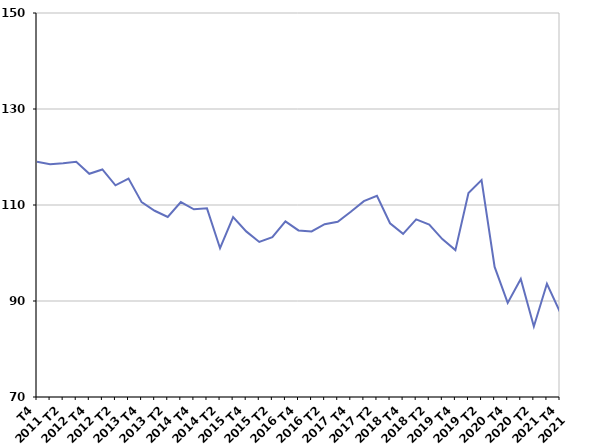
| Category | Fin de contrat |
|---|---|
| T4
2011 | 119 |
| T1
2012 | 118.5 |
| T2
2012 | 118.7 |
| T3
2012 | 119 |
| T4
2012 | 116.5 |
| T1
2013 | 117.4 |
| T2
2013 | 114.1 |
| T3
2013 | 115.5 |
| T4
2013 | 110.6 |
| T1
2014 | 108.8 |
| T2
2014 | 107.5 |
| T3
2014 | 110.6 |
| T4
2014 | 109.1 |
| T1
2015 | 109.3 |
| T2
2015 | 101 |
| T3
2015 | 107.5 |
| T4
2015 | 104.5 |
| T1
2016 | 102.3 |
| T2
2016 | 103.3 |
| T3
2016 | 106.6 |
| T4
2016 | 104.7 |
| T1
2017 | 104.5 |
| T2
2017 | 106 |
| T3
2017 | 106.5 |
| T4
2017 | 108.6 |
| T1
2018 | 110.8 |
| T2
2018 | 111.9 |
| T3
2018 | 106.2 |
| T4
2018 | 104 |
| T1
2019 | 107 |
| T2
2019 | 105.9 |
| T3
2019 | 102.9 |
| T4
2019 | 100.6 |
| T1
2020 | 112.5 |
| T2
2020 | 115.2 |
| T3
2020 | 97.1 |
| T4
2020 | 89.6 |
| T1
2021 | 94.6 |
| T2
2021 | 84.7 |
| T3
2021 | 93.6 |
| T4
2021 | 87.7 |